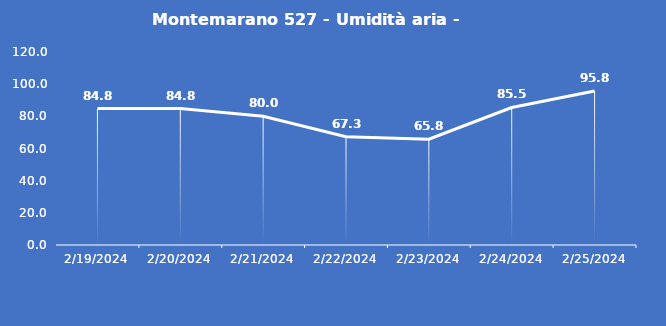
| Category | Montemarano 527 - Umidità aria - Grezzo (%) |
|---|---|
| 2/19/24 | 84.8 |
| 2/20/24 | 84.8 |
| 2/21/24 | 80 |
| 2/22/24 | 67.3 |
| 2/23/24 | 65.8 |
| 2/24/24 | 85.5 |
| 2/25/24 | 95.8 |